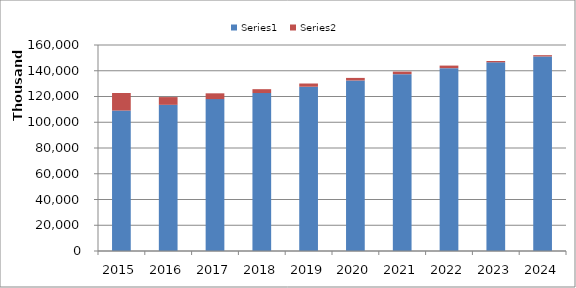
| Category | Series 0 | Series 1 |
|---|---|---|
| 2015.0 | 109088480 | 13621000 |
| 2016.0 | 113538641 | 6000000 |
| 2017.0 | 117966648 | 4500000 |
| 2018.0 | 122685314 | 3000000 |
| 2019.0 | 127592727 | 2500000 |
| 2020.0 | 132441251 | 2000000 |
| 2021.0 | 137341577 | 2000000 |
| 2022.0 | 142011191 | 2000000 |
| 2023.0 | 146555549 | 1000000 |
| 2024.0 | 151098771 | 1000000 |